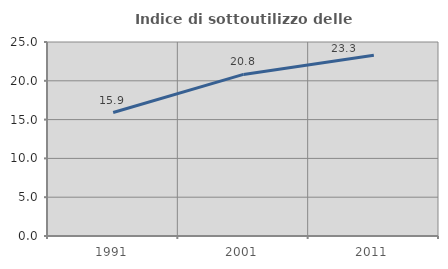
| Category | Indice di sottoutilizzo delle abitazioni  |
|---|---|
| 1991.0 | 15.914 |
| 2001.0 | 20.821 |
| 2011.0 | 23.295 |